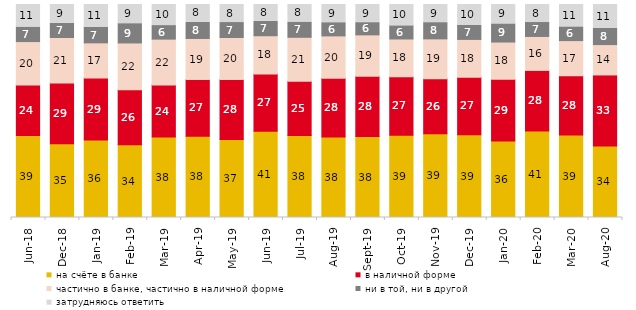
| Category | на счёте в банке | в наличной форме | частично в банке, частично в наличной форме | ни в той, ни в другой | затрудняюсь ответить |
|---|---|---|---|---|---|
| 2018-06-01 | 38.5 | 23.65 | 20.45 | 6.8 | 10.6 |
| 2018-12-01 | 34.6 | 28.55 | 21.35 | 6.65 | 8.85 |
| 2019-01-01 | 36.35 | 29.1 | 16.55 | 7.35 | 10.65 |
| 2019-02-01 | 34.2 | 25.75 | 22 | 9.05 | 9 |
| 2019-03-01 | 37.842 | 24.316 | 21.581 | 6.365 | 9.896 |
| 2019-04-01 | 38.119 | 26.634 | 19.307 | 7.574 | 8.366 |
| 2019-05-01 | 36.652 | 28.083 | 19.762 | 7.033 | 8.47 |
| 2019-06-01 | 40.549 | 26.833 | 17.955 | 6.733 | 7.93 |
| 2019-07-01 | 38.465 | 25.495 | 20.644 | 7.129 | 8.267 |
| 2019-08-01 | 37.812 | 27.522 | 19.93 | 6.194 | 8.541 |
| 2019-09-01 | 37.97 | 28.366 | 19.406 | 5.743 | 8.515 |
| 2019-10-01 | 38.663 | 27.426 | 17.723 | 6.188 | 10 |
| 2019-11-01 | 39.356 | 25.792 | 18.713 | 7.624 | 8.515 |
| 2019-12-01 | 38.812 | 27.079 | 17.723 | 6.535 | 9.851 |
| 2020-01-01 | 35.941 | 28.911 | 17.525 | 8.515 | 9.109 |
| 2020-02-01 | 40.644 | 28.416 | 15.941 | 6.535 | 8.465 |
| 2020-03-01 | 38.77 | 27.764 | 16.51 | 6.445 | 10.511 |
| 2020-08-01 | 33.565 | 33.366 | 14.25 | 7.547 | 11.271 |